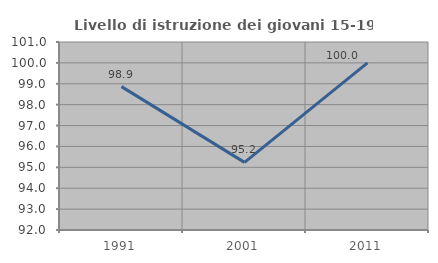
| Category | Livello di istruzione dei giovani 15-19 anni |
|---|---|
| 1991.0 | 98.864 |
| 2001.0 | 95.238 |
| 2011.0 | 100 |